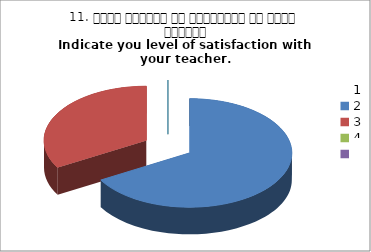
| Category | 11. अपने शिक्षक से संतुष्टि का स्तर बताइये
Indicate you level of satisfaction with your teacher.
 |
|---|---|
| 0 | 2 |
| 1 | 1 |
| 2 | 0 |
| 3 | 0 |
| 4 | 0 |